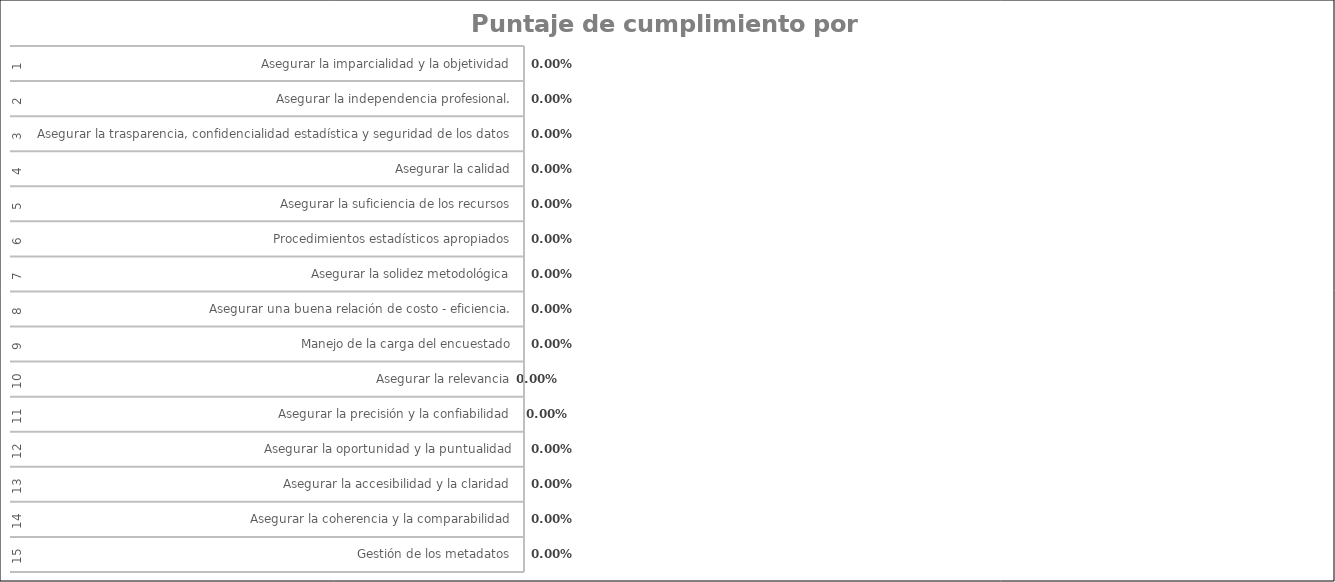
| Category | Total |
|---|---|
| 0 | 0 |
| 1 | 0 |
| 2 | 0 |
| 3 | 0 |
| 4 | 0 |
| 5 | 0 |
| 6 | 0 |
| 7 | 0 |
| 8 | 0 |
| 9 | 0 |
| 10 | 0 |
| 11 | 0 |
| 12 | 0 |
| 13 | 0 |
| 14 | 0 |